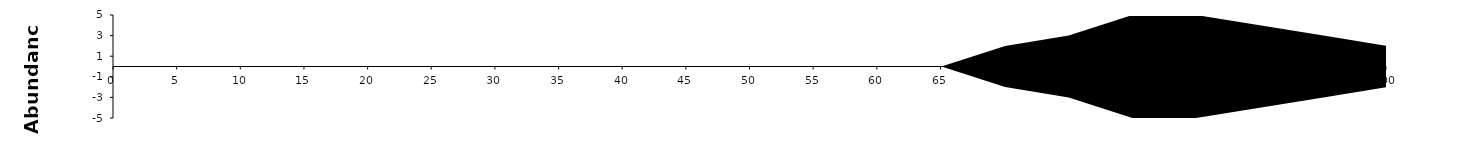
| Category | Series1 | Series2 |
|---|---|---|
| 0.0 | 0 | 0 |
| 5.0 | 0 | 0 |
| 10.0 | 0 | 0 |
| 15.0 | 0 | 0 |
| 20.0 | 0 | 0 |
| 25.0 | 0 | 0 |
| 30.0 | 0 | 0 |
| 35.0 | 0 | 0 |
| 40.0 | 0 | 0 |
| 45.0 | 0 | 0 |
| 50.0 | 0 | 0 |
| 55.0 | 0 | 0 |
| 60.0 | 0 | 0 |
| 65.0 | 0 | 0 |
| 70.0 | 2 | -2 |
| 75.0 | 3 | -3 |
| 80.0 | 5 | -5 |
| 85.0 | 5 | -5 |
| 90.0 | 4 | -4 |
| 95.0 | 3 | -3 |
| 100.0 | 2 | -2 |